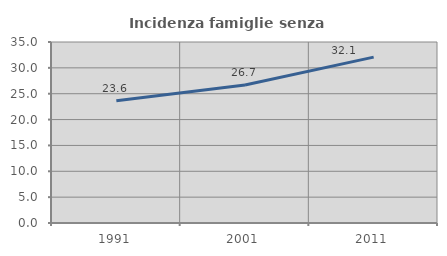
| Category | Incidenza famiglie senza nuclei |
|---|---|
| 1991.0 | 23.65 |
| 2001.0 | 26.701 |
| 2011.0 | 32.081 |